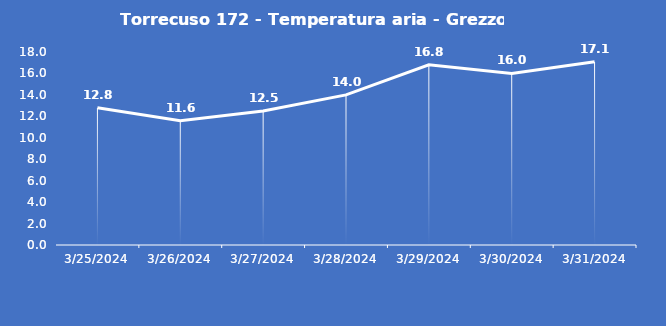
| Category | Torrecuso 172 - Temperatura aria - Grezzo (°C) |
|---|---|
| 3/25/24 | 12.8 |
| 3/26/24 | 11.6 |
| 3/27/24 | 12.5 |
| 3/28/24 | 14 |
| 3/29/24 | 16.8 |
| 3/30/24 | 16 |
| 3/31/24 | 17.1 |